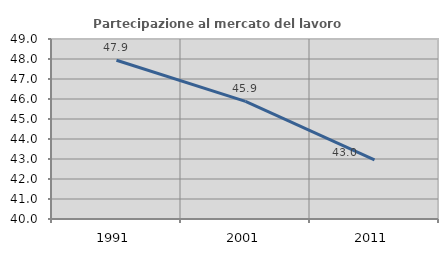
| Category | Partecipazione al mercato del lavoro  femminile |
|---|---|
| 1991.0 | 47.937 |
| 2001.0 | 45.884 |
| 2011.0 | 42.954 |